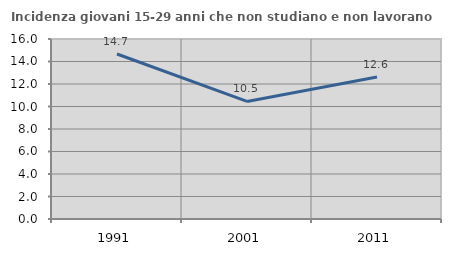
| Category | Incidenza giovani 15-29 anni che non studiano e non lavorano  |
|---|---|
| 1991.0 | 14.665 |
| 2001.0 | 10.451 |
| 2011.0 | 12.619 |